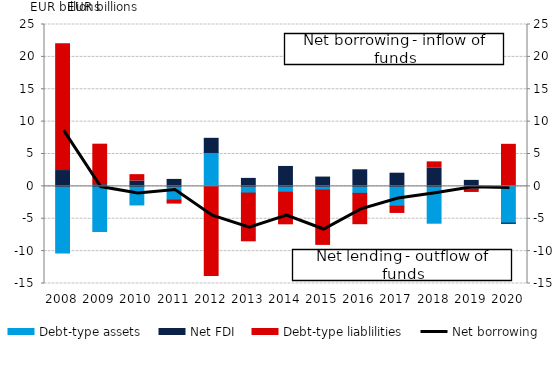
| Category | Debt-type assets | Net FDI | Debt-type liablilities |
|---|---|---|---|
| 2008.0 | -10.309 | 2.445 | 19.587 |
| 2009.0 | -6.97 | 0.259 | 6.258 |
| 2010.0 | -2.87 | 0.835 | 0.976 |
| 2011.0 | -2.116 | 1.076 | -0.621 |
| 2012.0 | 5.24 | 2.183 | -13.932 |
| 2013.0 | -1.033 | 1.232 | -7.528 |
| 2014.0 | -0.901 | 3.078 | -5.035 |
| 2015.0 | -0.567 | 1.438 | -8.546 |
| 2016.0 | -1.078 | 2.563 | -4.841 |
| 2017.0 | -3.061 | 2.037 | -1.118 |
| 2018.0 | -5.69 | 2.858 | 0.927 |
| 2019.0 | -0.389 | 0.926 | -0.548 |
| 2020.0 | -5.671 | -0.034 | 6.496 |